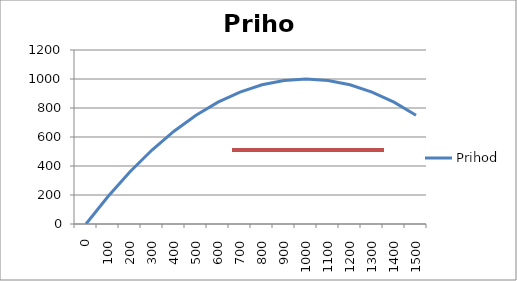
| Category | Prihod |
|---|---|
| 0.0 | 0 |
| 100.0 | 190 |
| 200.0 | 360 |
| 300.0 | 510 |
| 400.0 | 640 |
| 500.0 | 750 |
| 600.0 | 840 |
| 700.0 | 910 |
| 800.0 | 960 |
| 900.0 | 990 |
| 1000.0 | 1000 |
| 1100.0 | 990 |
| 1200.0 | 960 |
| 1300.0 | 910 |
| 1400.0 | 840 |
| 1500.0 | 750 |